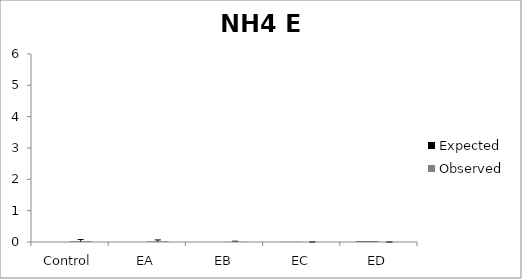
| Category | Expected | Observed |
|---|---|---|
| Control | 0 | 0.026 |
| EA | 0 | 0.022 |
| EB | 0 | 0.008 |
| EC | 0.004 | 0 |
| ED | 0.02 | 0 |